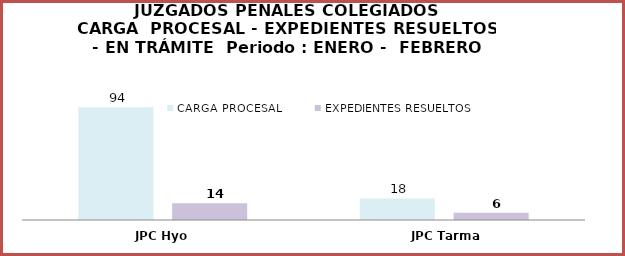
| Category | CARGA PROCESAL | EXPEDIENTES RESUELTOS |
|---|---|---|
| JPC Hyo | 94 | 14 |
| JPC Tarma | 18 | 6 |